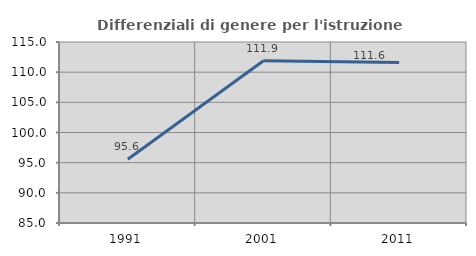
| Category | Differenziali di genere per l'istruzione superiore |
|---|---|
| 1991.0 | 95.575 |
| 2001.0 | 111.884 |
| 2011.0 | 111.584 |